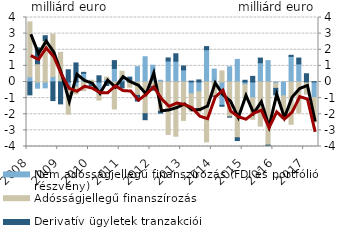
| Category | Nem adósságjellegű finanszírozás (FDI és portfólió részvény) | Adósságjellegű finanszírozás | Derivatív ügyletek tranzakciói |
|---|---|---|---|
| 2008.0 | 0.322 | 3.407 | -0.797 |
| 2008.0 | -0.385 | 1.131 | 0.986 |
| 2008.0 | -0.364 | 2.578 | 0.292 |
| 2008.0 | 0.334 | 2.628 | -1.152 |
| 2009.0 | 0.096 | 1.742 | -1.358 |
| 2009.0 | -0.495 | -1.502 | 0.758 |
| 2009.0 | -0.31 | -0.426 | 1.181 |
| 2009.0 | 0.54 | -0.537 | 0.06 |
| 2010.0 | -0.188 | 0.108 | -0.028 |
| 2010.0 | -0.709 | -0.411 | 0.384 |
| 2010.0 | 0.167 | 0.134 | -0.216 |
| 2010.0 | 0.841 | -1.672 | 0.485 |
| 2011.0 | 0.279 | 0.384 | -0.362 |
| 2011.0 | -0.045 | -0.279 | 0.301 |
| 2011.0 | 0.951 | -0.827 | -0.355 |
| 2011.0 | 1.566 | -1.967 | -0.372 |
| 2012.0 | 1.038 | -0.282 | -0.228 |
| 2012.0 | 0.107 | -1.816 | -0.112 |
| 2012.0 | 1.307 | -3.251 | 0.185 |
| 2012.0 | 1.29 | -3.363 | 0.461 |
| 2013.0 | 0.752 | -2.385 | 0.238 |
| 2013.0 | -0.734 | -1.079 | 0.057 |
| 2013.0 | -0.601 | -1.268 | 0.129 |
| 2013.0 | 2.002 | -3.715 | 0.193 |
| 2014.0 | 0.8 | -0.873 | -0.015 |
| 2014.0 | -1.445 | 0.687 | -0.062 |
| 2014.0 | 0.944 | -2.164 | -0.012 |
| 2014.0 | 1.399 | -3.458 | -0.175 |
| 2015.0 | -0.156 | -0.816 | 0.108 |
| 2015.0 | -0.973 | -1.339 | 0.349 |
| 2015.0 | 1.195 | -2.737 | 0.289 |
| 2015.0 | 1.327 | -3.914 | -0.059 |
| 2016.0 | -0.081 | -0.31 | -0.406 |
| 2016.0 | -0.856 | -1.301 | -0.078 |
| 2016.0 | 1.587 | -2.624 | 0.07 |
| 2016.0 | 1.125 | -1.915 | 0.361 |
| 2017.0 | 0.006 | -0.755 | 0.507 |
| 2017.0 | -0.962 | -1.532 | 0.016 |